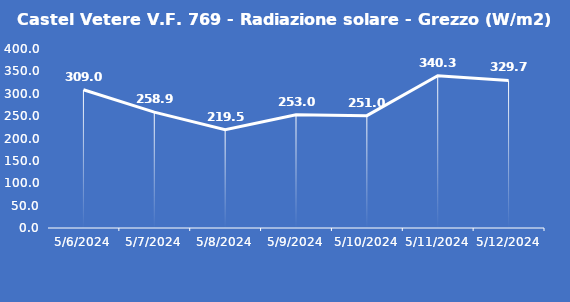
| Category | Castel Vetere V.F. 769 - Radiazione solare - Grezzo (W/m2) |
|---|---|
| 5/6/24 | 309 |
| 5/7/24 | 258.9 |
| 5/8/24 | 219.5 |
| 5/9/24 | 253 |
| 5/10/24 | 251 |
| 5/11/24 | 340.3 |
| 5/12/24 | 329.7 |